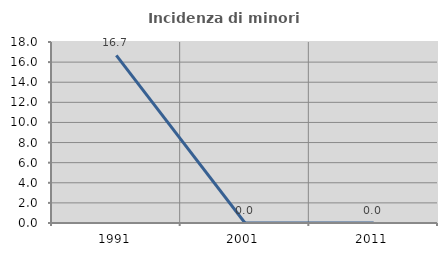
| Category | Incidenza di minori stranieri |
|---|---|
| 1991.0 | 16.667 |
| 2001.0 | 0 |
| 2011.0 | 0 |